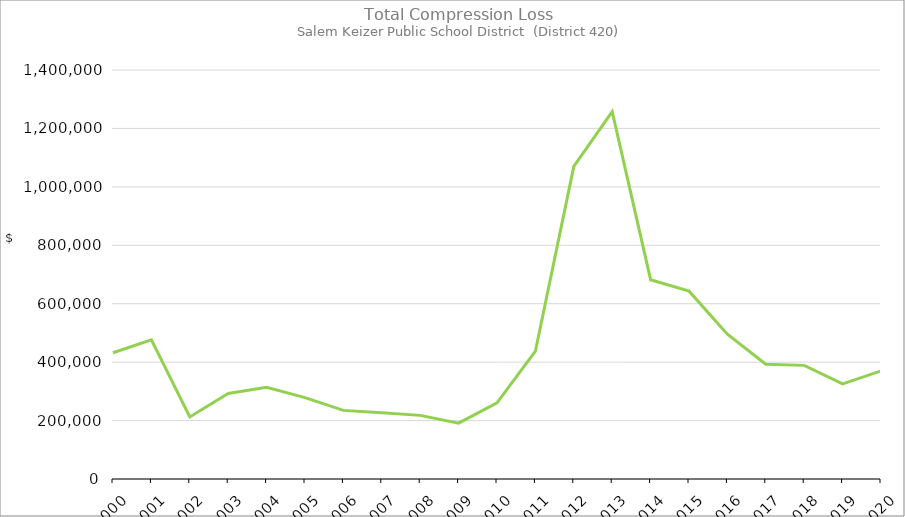
| Category | Series 0 |
|---|---|
| 2000.0 | 432031.68 |
| 2001.0 | 476559.01 |
| 2002.0 | 212519.23 |
| 2003.0 | 292513.3 |
| 2004.0 | 314194.22 |
| 2005.0 | 278540.21 |
| 2006.0 | 234894.96 |
| 2007.0 | 226880.22 |
| 2008.0 | 217808.38 |
| 2009.0 | 191158.89 |
| 2010.0 | 260920.13 |
| 2011.0 | 437318.36 |
| 2012.0 | 1069977.08 |
| 2013.0 | 1257773.36 |
| 2014.0 | 682237.83 |
| 2015.0 | 642938.74 |
| 2016.0 | 495568.3 |
| 2017.0 | 392835.25 |
| 2018.0 | 388958.97 |
| 2019.0 | 325276.44 |
| 2020.0 | 370045.37 |